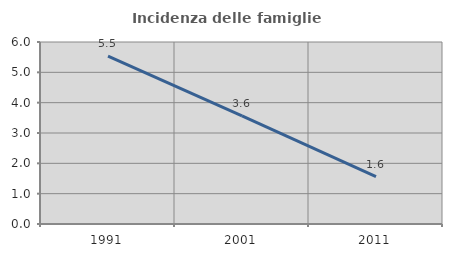
| Category | Incidenza delle famiglie numerose |
|---|---|
| 1991.0 | 5.533 |
| 2001.0 | 3.564 |
| 2011.0 | 1.559 |